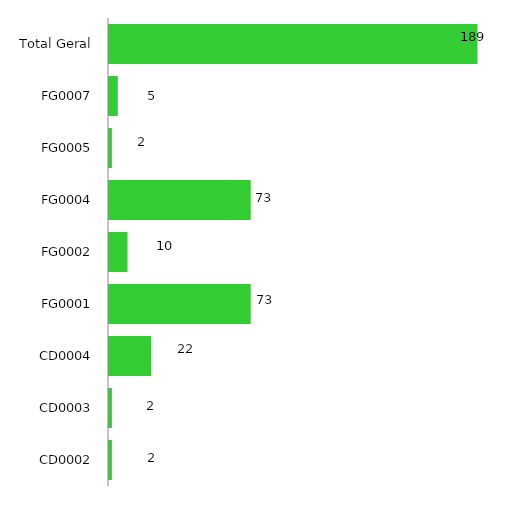
| Category | 2017 |
|---|---|
| CD0002 | 2 |
| CD0003 | 2 |
| CD0004 | 22 |
| FG0001 | 73 |
| FG0002 | 10 |
| FG0004 | 73 |
| FG0005 | 2 |
| FG0007 | 5 |
| Total Geral | 189 |